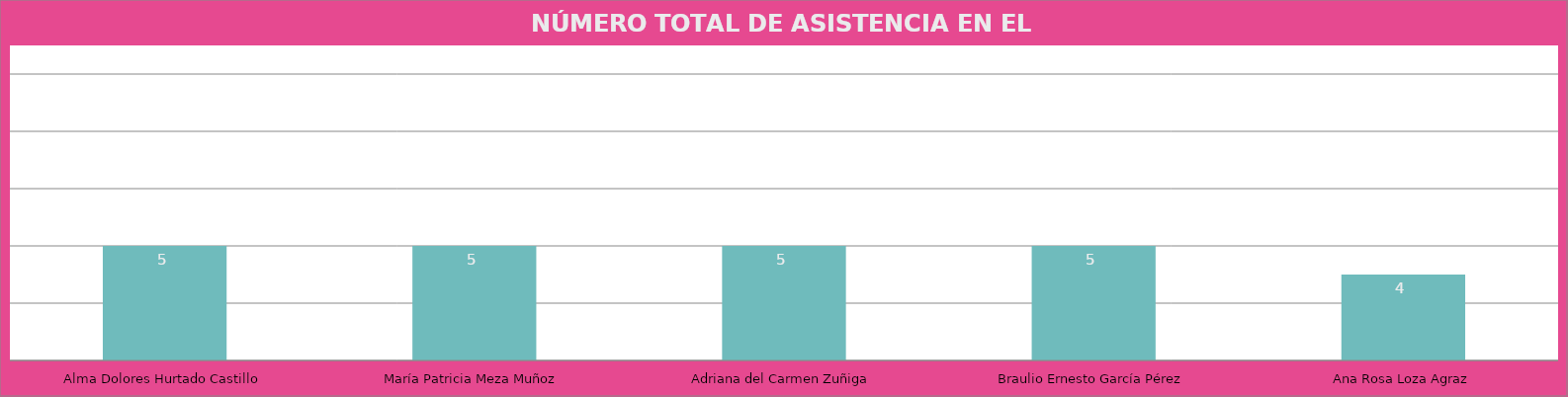
| Category | Alma Dolores Hurtado Castillo |
|---|---|
| Alma Dolores Hurtado Castillo | 5 |
| María Patricia Meza Muñoz | 5 |
| Adriana del Carmen Zuñiga | 5 |
| Braulio Ernesto García Pérez | 5 |
| Ana Rosa Loza Agraz | 4 |